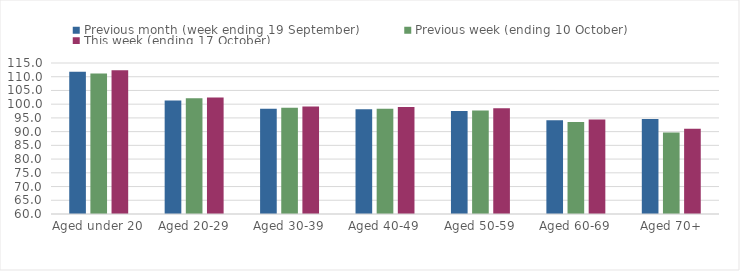
| Category | Previous month (week ending 19 September) | Previous week (ending 10 October) | This week (ending 17 October) |
|---|---|---|---|
| Aged under 20 | 111.79 | 111.22 | 112.38 |
| Aged 20-29 | 101.37 | 102.18 | 102.41 |
| Aged 30-39 | 98.32 | 98.68 | 99.18 |
| Aged 40-49 | 98.15 | 98.31 | 98.98 |
| Aged 50-59 | 97.52 | 97.69 | 98.48 |
| Aged 60-69 | 94.14 | 93.52 | 94.38 |
| Aged 70+ | 94.58 | 89.66 | 91.05 |